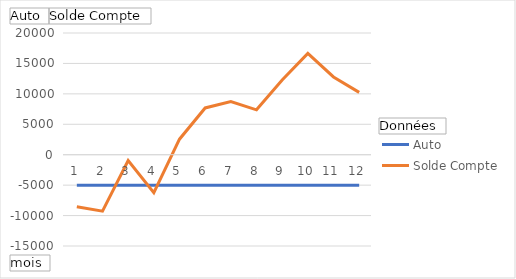
| Category | Auto | Solde Compte |
|---|---|---|
| 1 | -5000 | -8539.7 |
| 2 | -5000 | -9279.6 |
| 3 | -5000 | -970.4 |
| 4 | -5000 | -6232.95 |
| 5 | -5000 | 2553.2 |
| 6 | -5000 | 7686.8 |
| 7 | -5000 | 8734.05 |
| 8 | -5000 | 7376.05 |
| 9 | -5000 | 12288.9 |
| 10 | -5000 | 16655.2 |
| 11 | -5000 | 12776.1 |
| 12 | -5000 | 10248.1 |